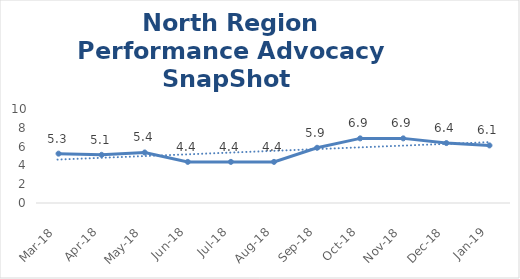
| Category | North Region |
|---|---|
| Mar-18 | 5.25 |
| Apr-18 | 5.125 |
| May-18 | 5.375 |
| Jun-18 | 4.375 |
| Jul-18 | 4.375 |
| Aug-18 | 4.375 |
| Sep-18 | 5.875 |
| Oct-18 | 6.875 |
| Nov-18 | 6.875 |
| Dec-18 | 6.375 |
| Jan-19 | 6.125 |